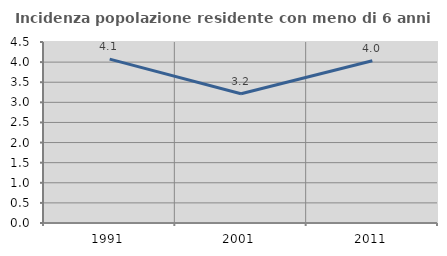
| Category | Incidenza popolazione residente con meno di 6 anni |
|---|---|
| 1991.0 | 4.074 |
| 2001.0 | 3.212 |
| 2011.0 | 4.032 |